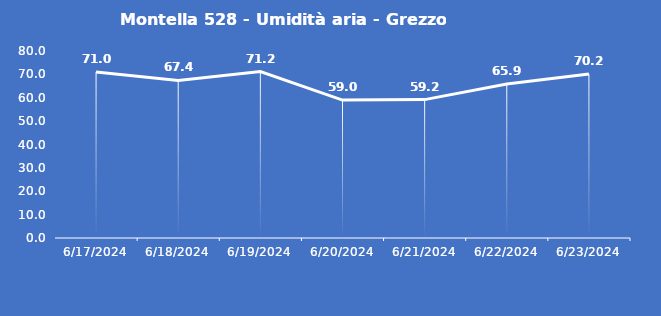
| Category | Montella 528 - Umidità aria - Grezzo (%) |
|---|---|
| 6/17/24 | 71 |
| 6/18/24 | 67.4 |
| 6/19/24 | 71.2 |
| 6/20/24 | 59 |
| 6/21/24 | 59.2 |
| 6/22/24 | 65.9 |
| 6/23/24 | 70.2 |